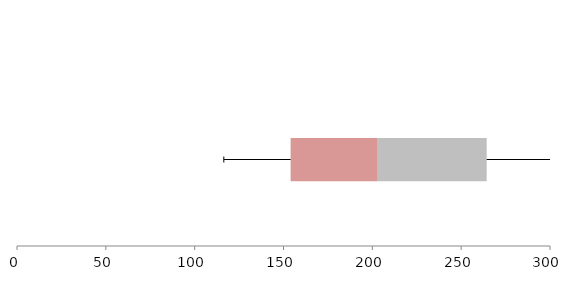
| Category | Series 1 | Series 2 | Series 3 |
|---|---|---|---|
| 0 | 154.01 | 49.053 | 61.294 |